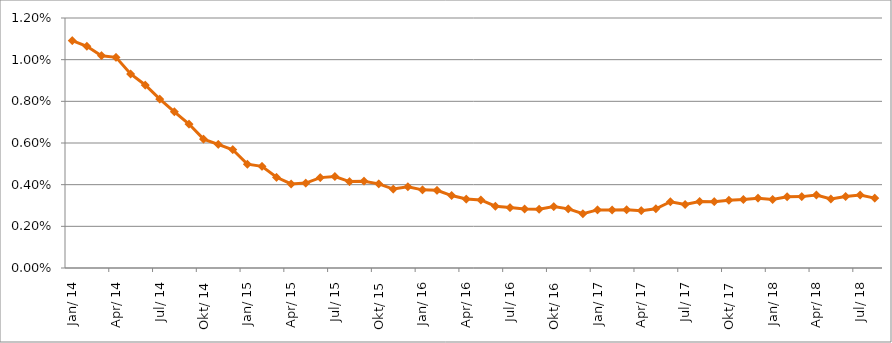
| Category | Durchschnittszins |
|---|---|
| 2014-01-01 | 0.011 |
| 2014-02-01 | 0.011 |
| 2014-03-01 | 0.01 |
| 2014-04-01 | 0.01 |
| 2014-05-01 | 0.009 |
| 2014-06-01 | 0.009 |
| 2014-07-01 | 0.008 |
| 2014-08-01 | 0.007 |
| 2014-09-01 | 0.007 |
| 2014-10-01 | 0.006 |
| 2014-11-01 | 0.006 |
| 2014-12-01 | 0.006 |
| 2015-01-01 | 0.005 |
| 2015-02-01 | 0.005 |
| 2015-03-01 | 0.004 |
| 2015-04-01 | 0.004 |
| 2015-05-01 | 0.004 |
| 2015-06-01 | 0.004 |
| 2015-07-01 | 0.004 |
| 2015-08-01 | 0.004 |
| 2015-09-01 | 0.004 |
| 2015-10-01 | 0.004 |
| 2015-11-01 | 0.004 |
| 2015-12-01 | 0.004 |
| 2016-01-01 | 0.004 |
| 2016-02-01 | 0.004 |
| 2016-03-01 | 0.003 |
| 2016-04-01 | 0.003 |
| 2016-05-01 | 0.003 |
| 2016-06-01 | 0.003 |
| 2016-07-01 | 0.003 |
| 2016-08-01 | 0.003 |
| 2016-09-01 | 0.003 |
| 2016-10-01 | 0.003 |
| 2016-11-01 | 0.003 |
| 2016-12-01 | 0.003 |
| 2017-01-01 | 0.003 |
| 2017-02-01 | 0.003 |
| 2017-03-01 | 0.003 |
| 2017-04-01 | 0.003 |
| 2017-05-01 | 0.003 |
| 2017-06-01 | 0.003 |
| 2017-07-01 | 0.003 |
| 2017-08-01 | 0.003 |
| 2017-09-01 | 0.003 |
| 2017-10-01 | 0.003 |
| 2017-11-01 | 0.003 |
| 2017-12-01 | 0.003 |
| 2018-01-01 | 0.003 |
| 2018-02-01 | 0.003 |
| 2018-03-01 | 0.003 |
| 2018-04-01 | 0.004 |
| 2018-05-01 | 0.003 |
| 2018-06-01 | 0.003 |
| 2018-07-01 | 0.003 |
| 2018-08-01 | 0.003 |